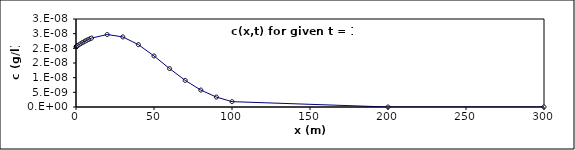
| Category | Series 0 |
|---|---|
| 0.1 | 0 |
| 0.2 | 0 |
| 0.3 | 0 |
| 0.4 | 0 |
| 0.5 | 0 |
| 0.6 | 0 |
| 0.7 | 0 |
| 0.8 | 0 |
| 0.9 | 0 |
| 1.0 | 0 |
| 2.0 | 0 |
| 3.0 | 0 |
| 4.0 | 0 |
| 5.0 | 0 |
| 6.0 | 0 |
| 7.0 | 0 |
| 8.0 | 0 |
| 9.0 | 0 |
| 10.0 | 0 |
| 20.0 | 0 |
| 30.0 | 0 |
| 40.0 | 0 |
| 50.0 | 0 |
| 60.0 | 0 |
| 70.0 | 0 |
| 80.0 | 0 |
| 90.0 | 0 |
| 100.0 | 0 |
| 200.0 | 0 |
| 300.0 | 0 |
| 400.0 | 0 |
| 500.0 | 0 |
| 600.0 | 0 |
| 700.0 | 0 |
| 800.0 | 0 |
| 900.0 | 0 |
| 1000.0 | 0 |